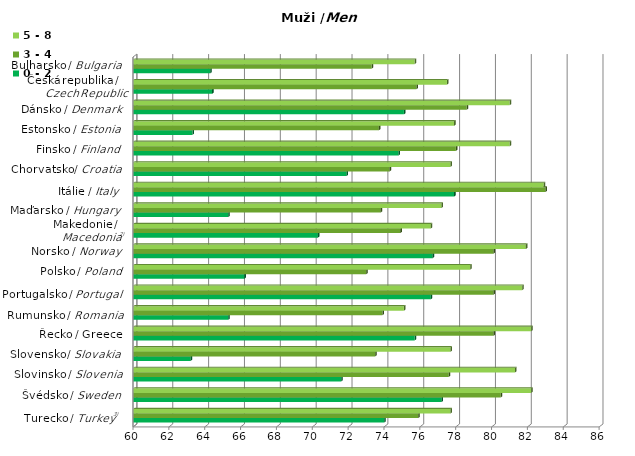
| Category | 0 - 2 | 3 - 4 | 5 - 8 |
|---|---|---|---|
|  | 74 | 75.9 | 77.7 |
|  | 77.2 | 80.5 | 82.2 |
|  | 71.6 | 77.6 | 81.3 |
|  | 63.2 | 73.5 | 77.7 |
|  | 75.7 | 80.1 | 82.2 |
|  | 65.3 | 73.9 | 75.1 |
|  | 76.6 | 80.1 | 81.7 |
|  | 66.2 | 73 | 78.8 |
|  | 76.7 | 80.1 | 81.9 |
|  | 70.3 | 74.9 | 76.6 |
|  | 65.3 | 73.8 | 77.2 |
|  | 77.9 | 83 | 82.9 |
|  | 71.9 | 74.3 | 77.7 |
|  | 74.8 | 78 | 81 |
|  | 63.3 | 73.7 | 77.9 |
|  | 75.1 | 78.6 | 81 |
|  | 64.4 | 75.8 | 77.5 |
|  | 64.3 | 73.3 | 75.7 |